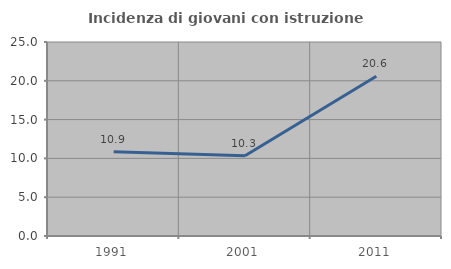
| Category | Incidenza di giovani con istruzione universitaria |
|---|---|
| 1991.0 | 10.87 |
| 2001.0 | 10.345 |
| 2011.0 | 20.588 |